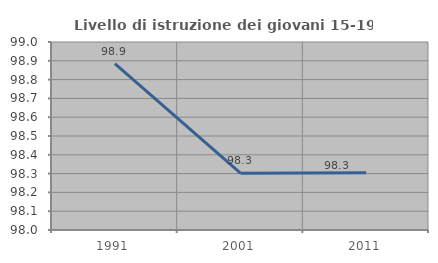
| Category | Livello di istruzione dei giovani 15-19 anni |
|---|---|
| 1991.0 | 98.885 |
| 2001.0 | 98.302 |
| 2011.0 | 98.305 |